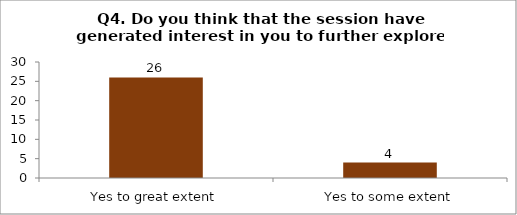
| Category | Q4. Do you think that the session have generated interest in you to further explore the topics? |
|---|---|
| Yes to great extent | 26 |
| Yes to some extent | 4 |